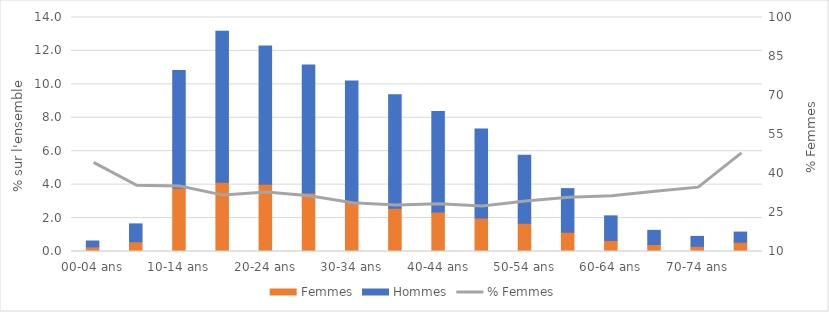
| Category | Femmes | Hommes |
|---|---|---|
| 00-04 ans | 0.277 | 0.351 |
| 05-09 ans | 0.582 | 1.069 |
| 10-14 ans | 3.792 | 7.041 |
| 15-19 ans | 4.15 | 9.024 |
| 20-24 ans | 4.018 | 8.279 |
| 25-29 ans | 3.493 | 7.669 |
| 30-34 ans | 2.916 | 7.287 |
| 35-39 ans | 2.593 | 6.784 |
| 40-44 ans | 2.358 | 6.018 |
| 45-49 ans | 2.001 | 5.321 |
| 50-54 ans | 1.683 | 4.071 |
| 55-59 ans | 1.154 | 2.606 |
| 60-64 ans | 0.666 | 1.465 |
| 65-69 ans | 0.417 | 0.847 |
| 70-74 ans | 0.312 | 0.592 |
| 75 ans et plus | 0.555 | 0.608 |